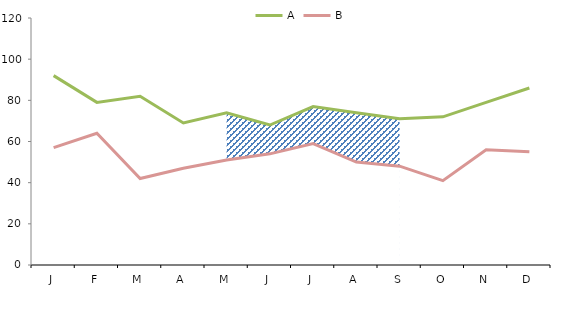
| Category | A | B |
|---|---|---|
| J | 92 | 57 |
| F | 79 | 64 |
| M | 82 | 42 |
| A | 69 | 47 |
| M | 74 | 51 |
| J | 68 | 54 |
| J | 77 | 59 |
| A | 74 | 50 |
| S | 71 | 48 |
| O | 72 | 41 |
| N | 79 | 56 |
| D | 86 | 55 |